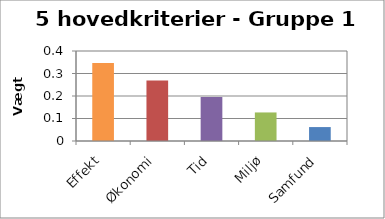
| Category | Vægt 1 |
|---|---|
| Effekt | 0.347 |
| Økonomi | 0.269 |
| Tid | 0.196 |
| Miljø | 0.127 |
| Samfund | 0.062 |